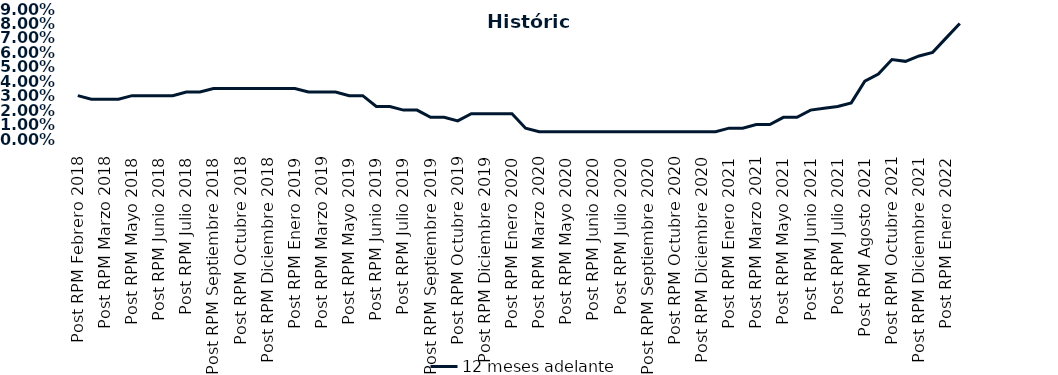
| Category | 12 meses adelante  |
|---|---|
| Post RPM Febrero 2018 | 0.03 |
| Pre RPM Marzo 2018 | 0.028 |
| Post RPM Marzo 2018 | 0.028 |
| Pre RPM Mayo 2018 | 0.028 |
| Post RPM Mayo 2018 | 0.03 |
| Pre RPM Junio 2018 | 0.03 |
| Post RPM Junio 2018 | 0.03 |
| Pre RPM Julio 2018 | 0.03 |
| Post RPM Julio 2018 | 0.032 |
| Pre RPM Septiembre 2018 | 0.032 |
| Post RPM Septiembre 2018 | 0.035 |
| Pre RPM Octubre 2018 | 0.035 |
| Post RPM Octubre 2018 | 0.035 |
| Pre RPM Diciembre 2018 | 0.035 |
| Post RPM Diciembre 2018 | 0.035 |
| Pre RPM Enero 2019 | 0.035 |
| Post RPM Enero 2019 | 0.035 |
| Pre RPM Marzo 2019 | 0.032 |
| Post RPM Marzo 2019 | 0.032 |
| Pre RPM Mayo 2019 | 0.032 |
| Post RPM Mayo 2019 | 0.03 |
| Pre RPM Junio 2019 | 0.03 |
| Post RPM Junio 2019 | 0.022 |
| Pre RPM Julio 2019 | 0.022 |
| Post RPM Julio 2019 | 0.02 |
| Pre RPM Septiembre 2019 | 0.02 |
| Post RPM Septiembre 2019 | 0.015 |
| Pre RPM Octubre 2019 | 0.015 |
| Post RPM Octubre 2019 | 0.012 |
| Pre RPM Diciembre 2019 | 0.018 |
| Post RPM Diciembre 2019 | 0.018 |
| Pre RPM Enero 2020 | 0.018 |
| Post RPM Enero 2020 | 0.018 |
| Pre RPM Marzo 2020 | 0.008 |
| Post RPM Marzo 2020 | 0.005 |
| Pre RPM Mayo 2020 | 0.005 |
| Post RPM Mayo 2020 | 0.005 |
| Pre RPM Junio 2020 | 0.005 |
| Post RPM Junio 2020 | 0.005 |
| Pre RPM Julio 2020 | 0.005 |
| Post RPM Julio 2020 | 0.005 |
| Pre RPM Septiembre 2020 | 0.005 |
| Post RPM Septiembre 2020 | 0.005 |
| Pre RPM Octubre 2020 | 0.005 |
| Post RPM Octubre 2020 | 0.005 |
| Pre RPM Diciembre 2020 | 0.005 |
| Post RPM Diciembre 2020 | 0.005 |
| Pre RPM Enero 2021 | 0.005 |
| Post RPM Enero 2021 | 0.008 |
| Pre RPM Marzo 2021 | 0.008 |
| Post RPM Marzo 2021 | 0.01 |
| Pre RPM Mayo 2021 | 0.01 |
| Post RPM Mayo 2021 | 0.015 |
| Pre RPM Junio 2021 | 0.015 |
| Post RPM Junio 2021 | 0.02 |
| Pre RPM Julio 2021 | 0.021 |
| Post RPM Julio 2021 | 0.022 |
| Pre RPM Agosto 2021 | 0.025 |
| Post RPM Agosto 2021 | 0.04 |
| Pre RPM Octubre 2021 | 0.045 |
| Post RPM Octubre 2021 | 0.055 |
| Pre RPM Diciembre 2021 | 0.054 |
| Post RPM Diciembre 2021 | 0.058 |
| Pre RPM Enero 2022 | 0.06 |
| Post RPM Enero 2022 | 0.07 |
| Pre RPM Marzo 2022 | 0.08 |